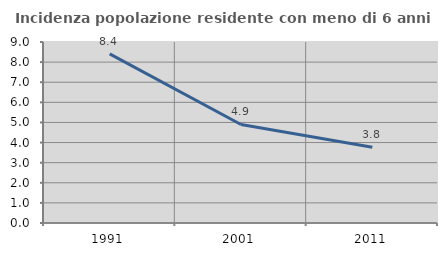
| Category | Incidenza popolazione residente con meno di 6 anni |
|---|---|
| 1991.0 | 8.407 |
| 2001.0 | 4.898 |
| 2011.0 | 3.766 |